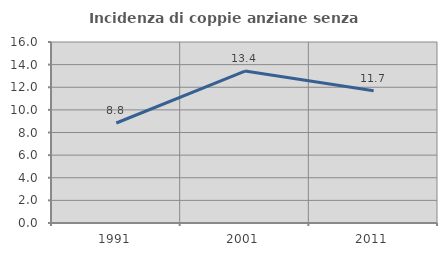
| Category | Incidenza di coppie anziane senza figli  |
|---|---|
| 1991.0 | 8.84 |
| 2001.0 | 13.435 |
| 2011.0 | 11.69 |